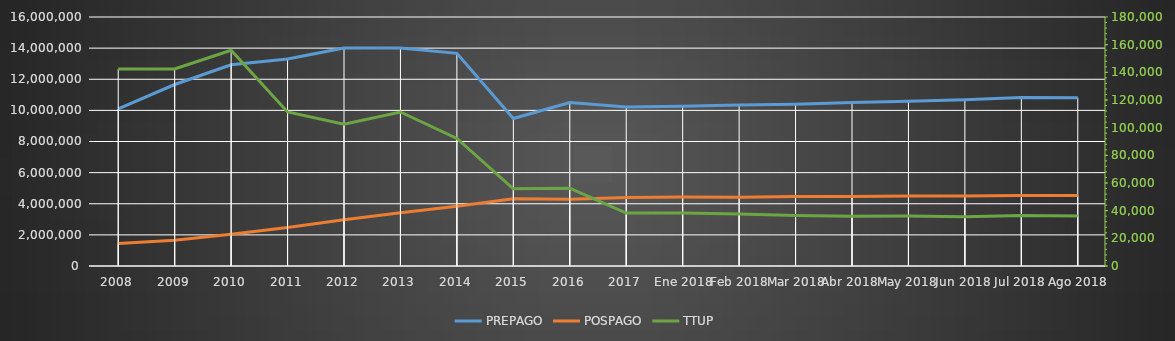
| Category | PREPAGO | POSPAGO |
|---|---|---|
| 2008 | 10097768 | 1452088 |
| 2009 | 11662294 | 1649838 |
| 2010 | 12929040 | 2033814 |
| 2011 | 13295834 | 2467378 |
| 2012 | 14008104 | 2976194 |
| 2013 | 14005126 | 3425277 |
| 2014 | 13666071 | 3846271 |
| 2015 | 9476240 | 4326937 |
| 2016 | 10498467 | 4293426 |
| 2017 | 10219457 | 4393703 |
| Ene 2018 | 10259532 | 4428678 |
| Feb 2018 | 10340854 | 4423642 |
| Mar 2018 | 10398800 | 4458485 |
| Abr 2018 | 10503620 | 4472367 |
| May 2018 | 10586464 | 4491946 |
| Jun 2018 | 10685666 | 4502254 |
| Jul 2018 | 10823450 | 4524125 |
| Ago 2018 | 10813260 | 4524326 |